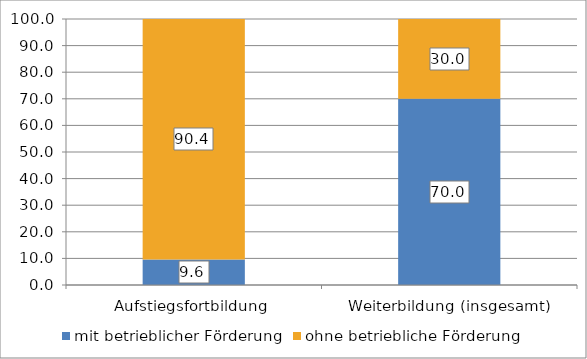
| Category | mit betrieblicher Förderung  | ohne betriebliche Förderung  |
|---|---|---|
| Aufstiegsfortbildung  | 9.6 | 90.4 |
| Weiterbildung (insgesamt) | 70 | 30 |